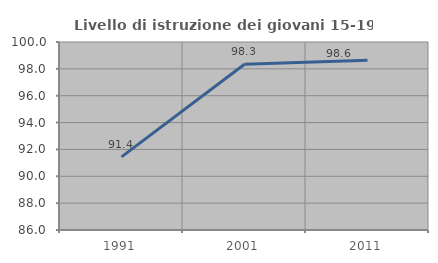
| Category | Livello di istruzione dei giovani 15-19 anni |
|---|---|
| 1991.0 | 91.444 |
| 2001.0 | 98.345 |
| 2011.0 | 98.641 |